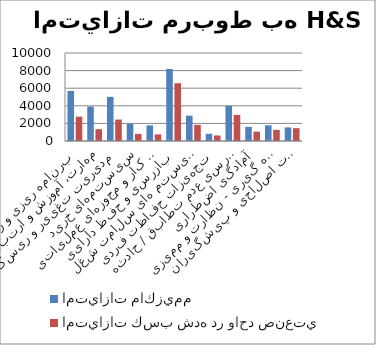
| Category | امتيازات ماكزيمم | امتيازات كسب شده در واحد صنعتي |
|---|---|---|
| برنامه ریزی و رهبری | 5690 | 2767 |
| مهارت، آموزش و ارتباطات | 3915 | 1345 |
| مدیریت تغییر و ریسک | 5020 | 2435 |
| سیستمهای خرید | 1970 | 810 |
| قوانین کار و مجوزهای عملیاتی | 1780 | 750 |
| بازرسی و حفظ دارایی | 8180 | 6565 |
| سیستم های سلامت شغلی | 2880 | 1835 |
| تجهیزات حفاظت فردی | 820 | 630 |
| گزارش و بررسی عدم تطابق / حادثه | 4000 | 2970 |
| آمادگی اضطراری | 1610 | 1063 |
| اندازه گیری - نظارت و ممیزی | 1785 | 1265 |
| سیستم اقدامات اصلاحی و پیشگیرانه | 1545 | 1455 |